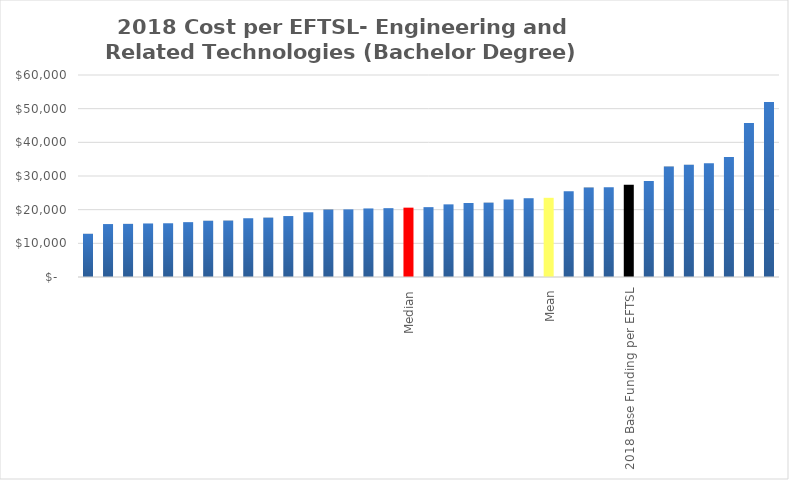
| Category | Series 0 |
|---|---|
|  | 12837.106 |
|  | 15725.503 |
|  | 15783.627 |
|  | 15903.695 |
|  | 15961.974 |
|  | 16292.562 |
|  | 16711.332 |
|  | 16759.455 |
|  | 17452.383 |
|  | 17632.462 |
|  | 18103.668 |
|  | 19227.627 |
|  | 20039.818 |
|  | 20085.698 |
|  | 20363.629 |
|  | 20446.197 |
| Median | 20597.988 |
|  | 20749.778 |
|  | 21577.337 |
|  | 21980.769 |
|  | 22085.152 |
|  | 23022.495 |
|  | 23398.427 |
| Mean | 23521.248 |
|  | 25500.845 |
|  | 26580.909 |
|  | 26688.464 |
| 2018 Base Funding per EFTSL | 27425 |